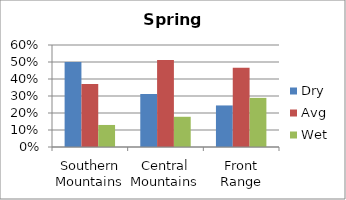
| Category | Dry | Avg | Wet |
|---|---|---|---|
| Southern Mountains | 0.5 | 0.37 | 0.13 |
| Central Mountains | 0.311 | 0.511 | 0.178 |
| Front Range | 0.244 | 0.467 | 0.289 |